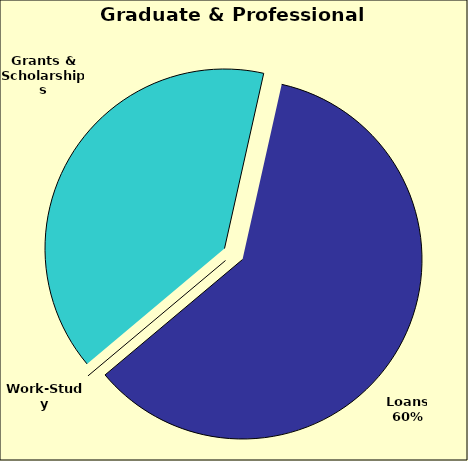
| Category | Series 0 |
|---|---|
| Grants & Scholarships | 0.396 |
| Loans | 0.604 |
| Work-Study | 0 |